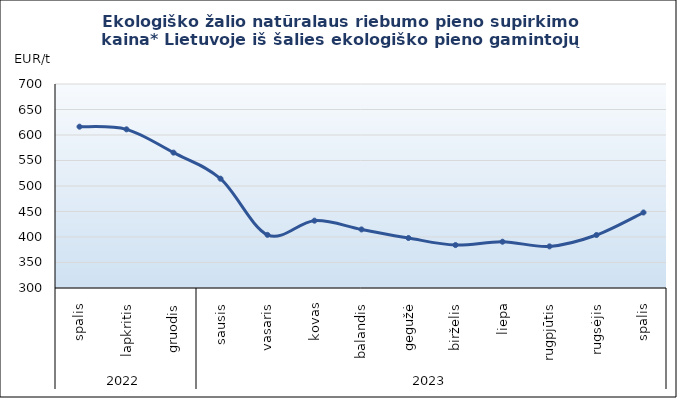
| Category | Ekologiško žalio natūralaus riebumo pieno supirkimo kaina* Lietuvoje iš šalies ekologiško pieno gamintojų |
|---|---|
| 0 | 616.34 |
| 1 | 611.11 |
| 2 | 565.47 |
| 3 | 514.35 |
| 4 | 404.16 |
| 5 | 432.04 |
| 6 | 414.83 |
| 7 | 398.01 |
| 8 | 384.19 |
| 9 | 390.73 |
| 10 | 381.58 |
| 11 | 403.91 |
| 12 | 448.04 |